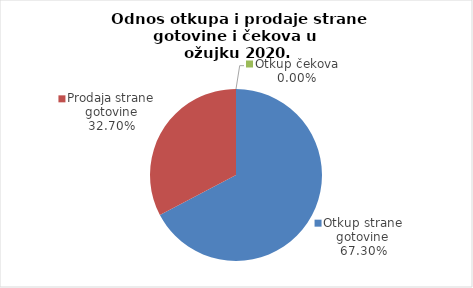
| Category | Series 0 |
|---|---|
| Otkup strane gotovine | 67.299 |
| Prodaja strane gotovine | 32.701 |
| Otkup čekova | 0 |